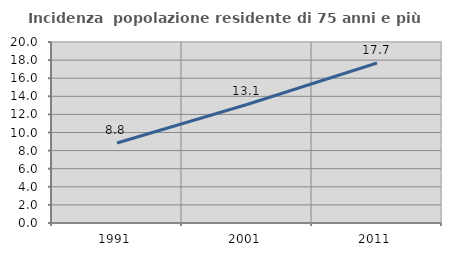
| Category | Incidenza  popolazione residente di 75 anni e più |
|---|---|
| 1991.0 | 8.839 |
| 2001.0 | 13.097 |
| 2011.0 | 17.682 |